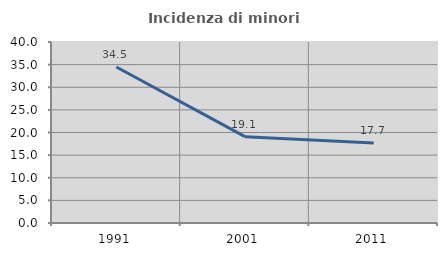
| Category | Incidenza di minori stranieri |
|---|---|
| 1991.0 | 34.483 |
| 2001.0 | 19.084 |
| 2011.0 | 17.69 |